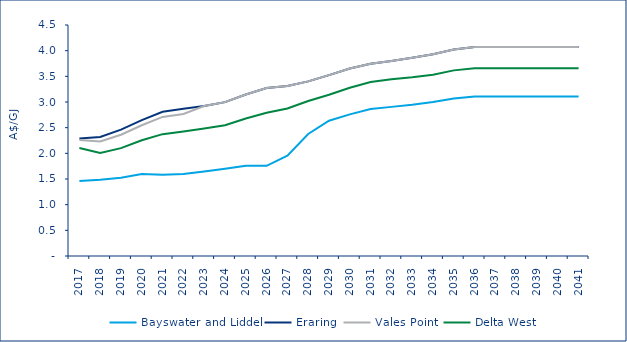
| Category | Bayswater and Liddel | Eraring | Vales Point | Delta West |
|---|---|---|---|---|
| 2017.0 | 1.463 | 2.29 | 2.262 | 2.104 |
| 2018.0 | 1.485 | 2.32 | 2.231 | 2.009 |
| 2019.0 | 1.526 | 2.462 | 2.362 | 2.101 |
| 2020.0 | 1.595 | 2.647 | 2.547 | 2.256 |
| 2021.0 | 1.585 | 2.809 | 2.709 | 2.374 |
| 2022.0 | 1.597 | 2.867 | 2.767 | 2.425 |
| 2023.0 | 1.645 | 2.923 | 2.923 | 2.482 |
| 2024.0 | 1.698 | 2.997 | 2.997 | 2.547 |
| 2025.0 | 1.756 | 3.147 | 3.147 | 2.68 |
| 2026.0 | 1.757 | 3.273 | 3.273 | 2.79 |
| 2027.0 | 1.955 | 3.31 | 3.31 | 2.873 |
| 2028.0 | 2.376 | 3.402 | 3.402 | 3.02 |
| 2029.0 | 2.636 | 3.524 | 3.524 | 3.142 |
| 2030.0 | 2.759 | 3.654 | 3.654 | 3.277 |
| 2031.0 | 2.863 | 3.746 | 3.746 | 3.391 |
| 2032.0 | 2.905 | 3.797 | 3.797 | 3.442 |
| 2033.0 | 2.946 | 3.862 | 3.862 | 3.481 |
| 2034.0 | 2.998 | 3.929 | 3.929 | 3.531 |
| 2035.0 | 3.07 | 4.023 | 4.023 | 3.616 |
| 2036.0 | 3.107 | 4.071 | 4.071 | 3.659 |
| 2037.0 | 3.107 | 4.071 | 4.071 | 3.659 |
| 2038.0 | 3.107 | 4.071 | 4.071 | 3.659 |
| 2039.0 | 3.107 | 4.071 | 4.071 | 3.659 |
| 2040.0 | 3.107 | 4.071 | 4.071 | 3.659 |
| 2041.0 | 3.107 | 4.071 | 4.071 | 3.659 |